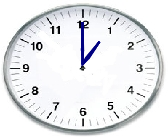
| Category | Series 0 |
|---|---|
| 0.0 | 0 |
| 0.09365164835397805 | 0.232 |
| 0.4500000000000001 | 0.779 |
| 0.15391536883141457 | 0.197 |
| 0.0 | 0 |
| 0.10959278669726936 | 0.225 |
| 0.4500000000000001 | 0.779 |
| 0.1397982258676867 | 0.207 |
| 0.0 | 0 |
| -0.017449748351250367 | 0.5 |
| 8.882326298087495e-17 | 1.45 |
| -0.008726203218641738 | 0.5 |
| 0.0 | 0 |
| 0.01744974835125054 | 0.5 |
| 8.882326298087495e-17 | 1.45 |
| 0.0087262032186418 | 0.5 |
| 0.0 | 0 |